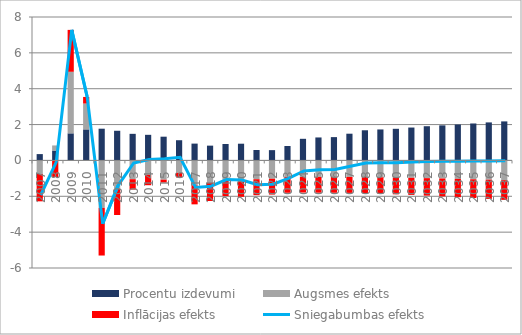
| Category | Procentu izdevumi | Augsmes efekts | Inflācijas efekts |
|---|---|---|---|
| 0 | 0.353 | -0.754 | -1.527 |
| 1 | 0.551 | 0.285 | -0.933 |
| 2 | 1.511 | 3.434 | 2.337 |
| 3 | 1.731 | 1.442 | 0.368 |
| 4 | 1.77 | -2.65 | -2.655 |
| 5 | 1.655 | -1.594 | -1.45 |
| 6 | 1.483 | -1.047 | -0.579 |
| 7 | 1.428 | -0.798 | -0.585 |
| 8 | 1.324 | -1.075 | -0.157 |
| 9 | 1.127 | -0.694 | -0.255 |
| 10 | 0.938 | -1.39 | -1.06 |
| 11 | 0.825 | -1.245 | -1.018 |
| 12 | 0.918 | -1.135 | -0.853 |
| 13 | 0.933 | -1.17 | -0.858 |
| 14 | 0.582 | -1.048 | -0.89 |
| 15 | 0.574 | -1.024 | -0.88 |
| 16 | 0.804 | -0.931 | -0.874 |
| 17 | 1.206 | -0.92 | -0.874 |
| 18 | 1.281 | -0.917 | -0.884 |
| 19 | 1.3 | -0.917 | -0.887 |
| 20 | 1.491 | -0.919 | -0.892 |
| 21 | 1.682 | -0.927 | -0.902 |
| 22 | 1.728 | -0.94 | -0.918 |
| 23 | 1.764 | -0.955 | -0.935 |
| 24 | 1.835 | -0.971 | -0.953 |
| 25 | 1.908 | -0.989 | -0.974 |
| 26 | 1.956 | -1.008 | -0.996 |
| 27 | 2.004 | -1.029 | -1.02 |
| 28 | 2.061 | -1.052 | -1.045 |
| 29 | 2.121 | -1.075 | -1.072 |
| 30 | 2.177 | -1.1 | -1.1 |